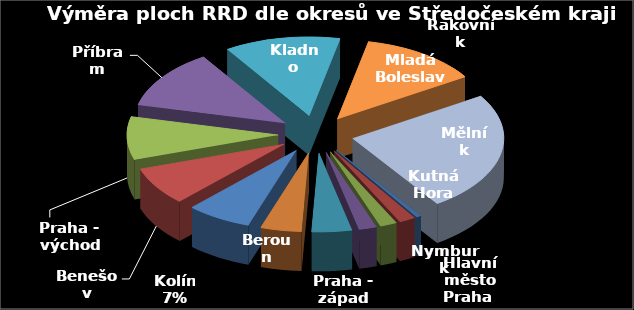
| Category | Výměra [ha] |
|---|---|
| Hlavní město Praha  | 1.2 |
| Nymburk | 3.97 |
| Kutná Hora | 4.11 |
| Mladá Boleslav | 4.34 |
| Praha - západ | 9.81 |
| Beroun | 10.03 |
| Kolín | 16.01 |
| Benešov | 17.89 |
| Praha - východ | 20.3 |
| Příbram | 27.92 |
| Kladno | 28.37 |
| Rakovník | 29.23 |
| Mělník | 56.31 |